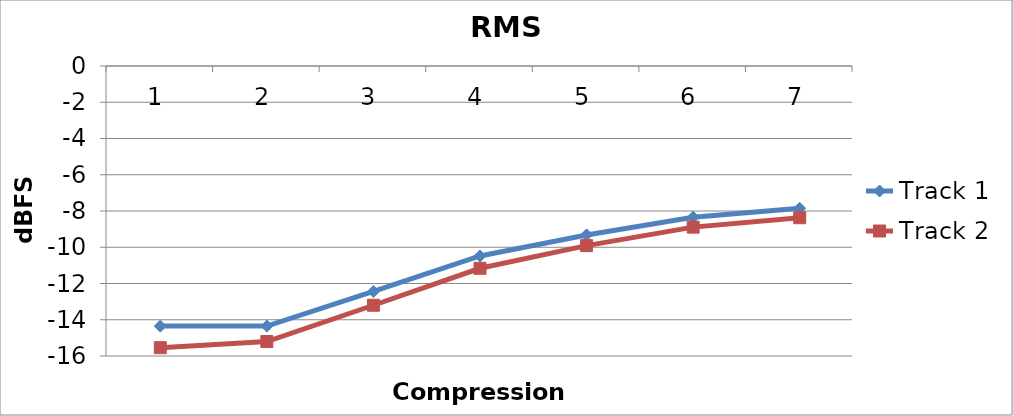
| Category | Track 1 | Track 2 |
|---|---|---|
| 0 | -14.35 | -15.54 |
| 1 | -14.35 | -15.2 |
| 2 | -12.44 | -13.2 |
| 3 | -10.48 | -11.16 |
| 4 | -9.32 | -9.91 |
| 5 | -8.34 | -8.89 |
| 6 | -7.85 | -8.37 |